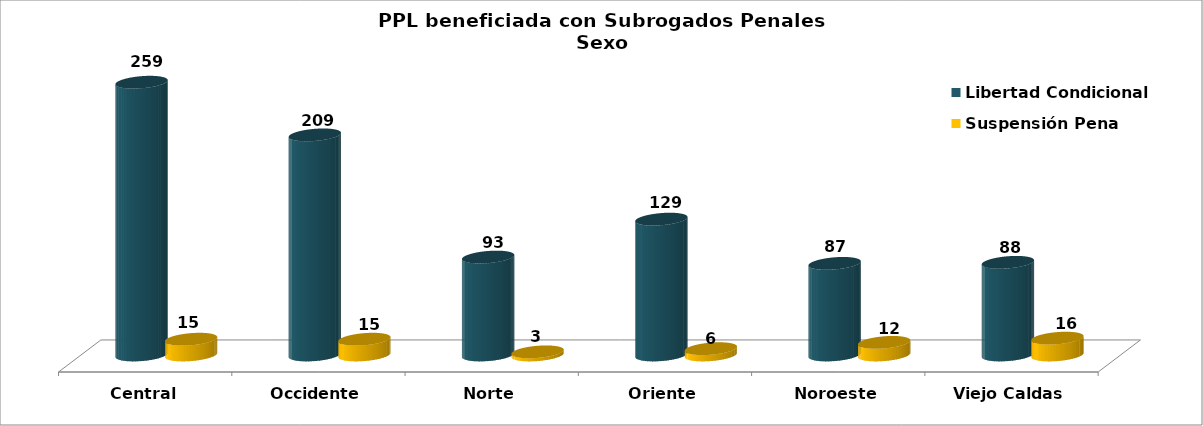
| Category | Libertad Condicional | Suspensión Pena |
|---|---|---|
| Central | 259 | 15 |
| Occidente | 209 | 15 |
| Norte | 93 | 3 |
| Oriente | 129 | 6 |
| Noroeste | 87 | 12 |
| Viejo Caldas | 88 | 16 |